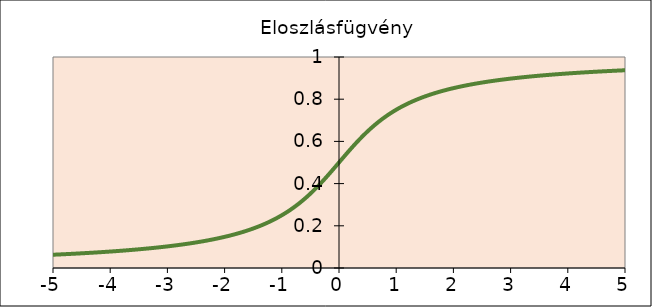
| Category | Series 0 |
|---|---|
| -5.0 | 0.063 |
| -4.9 | 0.064 |
| -4.8 | 0.065 |
| -4.7 | 0.067 |
| -4.6 | 0.068 |
| -4.5 | 0.07 |
| -4.4 | 0.071 |
| -4.3 | 0.073 |
| -4.2 | 0.074 |
| -4.1 | 0.076 |
| -4.0 | 0.078 |
| -3.9 | 0.08 |
| -3.8 | 0.082 |
| -3.7 | 0.084 |
| -3.6 | 0.086 |
| -3.50000000000001 | 0.089 |
| -3.40000000000001 | 0.091 |
| -3.30000000000001 | 0.094 |
| -3.20000000000001 | 0.096 |
| -3.10000000000001 | 0.099 |
| -3.00000000000001 | 0.102 |
| -2.90000000000001 | 0.106 |
| -2.80000000000001 | 0.109 |
| -2.70000000000001 | 0.113 |
| -2.60000000000001 | 0.117 |
| -2.50000000000001 | 0.121 |
| -2.40000000000001 | 0.126 |
| -2.30000000000001 | 0.131 |
| -2.20000000000001 | 0.136 |
| -2.10000000000001 | 0.141 |
| -2.00000000000001 | 0.148 |
| -1.90000000000001 | 0.154 |
| -1.80000000000001 | 0.161 |
| -1.70000000000001 | 0.169 |
| -1.60000000000001 | 0.178 |
| -1.50000000000001 | 0.187 |
| -1.40000000000001 | 0.197 |
| -1.30000000000001 | 0.209 |
| -1.20000000000001 | 0.221 |
| -1.10000000000001 | 0.235 |
| -1.00000000000001 | 0.25 |
| -0.90000000000001 | 0.267 |
| -0.80000000000001 | 0.285 |
| -0.70000000000002 | 0.306 |
| -0.60000000000002 | 0.328 |
| -0.50000000000002 | 0.352 |
| -0.40000000000002 | 0.379 |
| -0.30000000000002 | 0.407 |
| -0.20000000000002 | 0.437 |
| -0.10000000000002 | 0.468 |
| -2.04281036531029e-14 | 0.5 |
| 0.0999999999999801 | 0.532 |
| 0.19999999999998 | 0.563 |
| 0.29999999999998 | 0.593 |
| 0.39999999999998 | 0.621 |
| 0.49999999999998 | 0.648 |
| 0.59999999999998 | 0.672 |
| 0.69999999999998 | 0.694 |
| 0.79999999999998 | 0.715 |
| 0.89999999999998 | 0.733 |
| 0.99999999999998 | 0.75 |
| 1.09999999999998 | 0.765 |
| 1.19999999999998 | 0.779 |
| 1.29999999999998 | 0.791 |
| 1.39999999999998 | 0.803 |
| 1.49999999999998 | 0.813 |
| 1.59999999999998 | 0.822 |
| 1.69999999999998 | 0.831 |
| 1.79999999999998 | 0.839 |
| 1.89999999999998 | 0.846 |
| 1.99999999999998 | 0.852 |
| 2.09999999999997 | 0.859 |
| 2.19999999999997 | 0.864 |
| 2.29999999999997 | 0.869 |
| 2.39999999999997 | 0.874 |
| 2.49999999999997 | 0.879 |
| 2.59999999999997 | 0.883 |
| 2.69999999999997 | 0.887 |
| 2.79999999999997 | 0.891 |
| 2.89999999999997 | 0.894 |
| 2.99999999999997 | 0.898 |
| 3.09999999999997 | 0.901 |
| 3.19999999999997 | 0.904 |
| 3.29999999999997 | 0.906 |
| 3.39999999999997 | 0.909 |
| 3.49999999999997 | 0.911 |
| 3.59999999999997 | 0.914 |
| 3.69999999999997 | 0.916 |
| 3.79999999999997 | 0.918 |
| 3.89999999999997 | 0.92 |
| 3.99999999999997 | 0.922 |
| 4.09999999999997 | 0.924 |
| 4.19999999999997 | 0.926 |
| 4.29999999999997 | 0.927 |
| 4.39999999999997 | 0.929 |
| 4.49999999999997 | 0.93 |
| 4.59999999999997 | 0.932 |
| 4.69999999999997 | 0.933 |
| 4.79999999999997 | 0.935 |
| 4.89999999999996 | 0.936 |
| 4.99999999999996 | 0.937 |